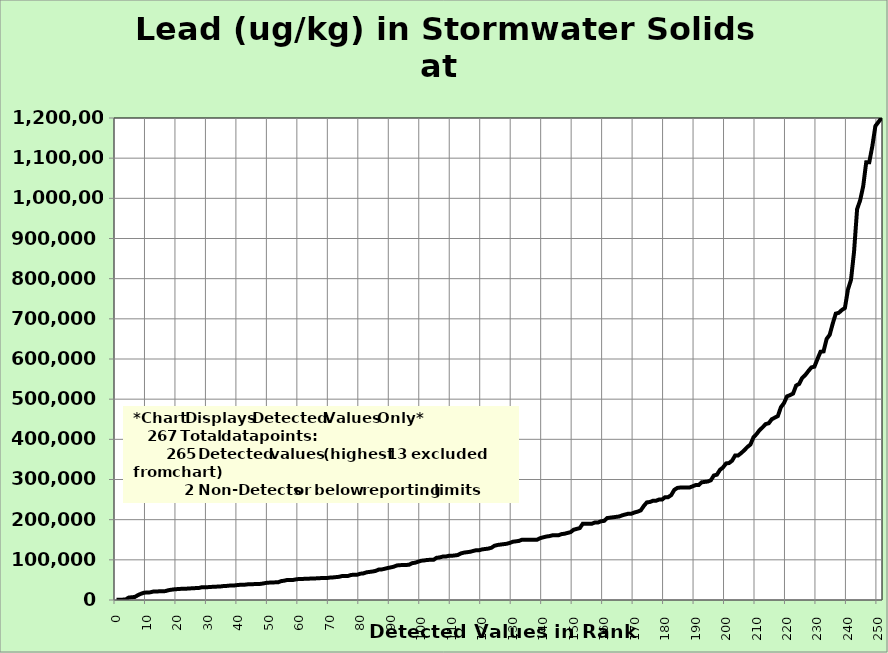
| Category | Lead |
|---|---|
| 0.0 | 323 |
| 1.0 | 347 |
| 2.0 | 887 |
| 3.0 | 1390 |
| 4.0 | 5980 |
| 5.0 | 6850 |
| 6.0 | 7530 |
| 7.0 | 12000 |
| 8.0 | 15500 |
| 9.0 | 18100 |
| 10.0 | 18700 |
| 11.0 | 19000 |
| 12.0 | 20900 |
| 13.0 | 21100 |
| 14.0 | 21600 |
| 15.0 | 22000 |
| 16.0 | 22100 |
| 17.0 | 24300 |
| 18.0 | 25600 |
| 19.0 | 26600 |
| 20.0 | 27200 |
| 21.0 | 27700 |
| 22.0 | 28100 |
| 23.0 | 28200 |
| 24.0 | 28900 |
| 25.0 | 29000 |
| 26.0 | 29700 |
| 27.0 | 29900 |
| 28.0 | 31800 |
| 29.0 | 32000 |
| 30.0 | 32000 |
| 31.0 | 32500 |
| 32.0 | 33200 |
| 33.0 | 33300 |
| 34.0 | 33600 |
| 35.0 | 34600 |
| 36.0 | 35000 |
| 37.0 | 35800 |
| 38.0 | 35900 |
| 39.0 | 36500 |
| 40.0 | 37500 |
| 41.0 | 38000 |
| 42.0 | 38000 |
| 43.0 | 39000 |
| 44.0 | 39300 |
| 45.0 | 39500 |
| 46.0 | 39900 |
| 47.0 | 39900 |
| 48.0 | 41000 |
| 49.0 | 42500 |
| 50.0 | 43200 |
| 51.0 | 43700 |
| 52.0 | 43900 |
| 53.0 | 44000 |
| 54.0 | 47000 |
| 55.0 | 48000 |
| 56.0 | 49900 |
| 57.0 | 50000 |
| 58.0 | 50000 |
| 59.0 | 51600 |
| 60.0 | 52300 |
| 61.0 | 52400 |
| 62.0 | 52900 |
| 63.0 | 53000 |
| 64.0 | 53600 |
| 65.0 | 53700 |
| 66.0 | 54000 |
| 67.0 | 54500 |
| 68.0 | 54500 |
| 69.0 | 54600 |
| 70.0 | 55800 |
| 71.0 | 56200 |
| 72.0 | 57000 |
| 73.0 | 57700 |
| 74.0 | 59700 |
| 75.0 | 59900 |
| 76.0 | 60000 |
| 77.0 | 62400 |
| 78.0 | 62900 |
| 79.0 | 63000 |
| 80.0 | 65500 |
| 81.0 | 66200 |
| 82.0 | 68900 |
| 83.0 | 69900 |
| 84.0 | 70900 |
| 85.0 | 72400 |
| 86.0 | 75700 |
| 87.0 | 76000 |
| 88.0 | 77800 |
| 89.0 | 79700 |
| 90.0 | 81200 |
| 91.0 | 83000 |
| 92.0 | 86000 |
| 93.0 | 86800 |
| 94.0 | 86900 |
| 95.0 | 87100 |
| 96.0 | 87900 |
| 97.0 | 91700 |
| 98.0 | 92800 |
| 99.0 | 95400 |
| 100.0 | 97800 |
| 101.0 | 98500 |
| 102.0 | 99800 |
| 103.0 | 100000 |
| 104.0 | 100000 |
| 105.0 | 105000 |
| 106.0 | 106000 |
| 107.0 | 108000 |
| 108.0 | 108000 |
| 109.0 | 110000 |
| 110.0 | 110000 |
| 111.0 | 111000 |
| 112.0 | 112000 |
| 113.0 | 116000 |
| 114.0 | 118000 |
| 115.0 | 119000 |
| 116.0 | 120000 |
| 117.0 | 122000 |
| 118.0 | 124000 |
| 119.0 | 124000 |
| 120.0 | 126000 |
| 121.0 | 127000 |
| 122.0 | 128000 |
| 123.0 | 130000 |
| 124.0 | 135000 |
| 125.0 | 137000 |
| 126.0 | 138000 |
| 127.0 | 139000 |
| 128.0 | 140000 |
| 129.0 | 142000 |
| 130.0 | 145000 |
| 131.0 | 146000 |
| 132.0 | 147000 |
| 133.0 | 150000 |
| 134.0 | 150000 |
| 135.0 | 150000 |
| 136.0 | 150000 |
| 137.0 | 150000 |
| 138.0 | 150000 |
| 139.0 | 154000 |
| 140.0 | 156000 |
| 141.0 | 158000 |
| 142.0 | 159000 |
| 143.0 | 161000 |
| 144.0 | 161000 |
| 145.0 | 161000 |
| 146.0 | 164000 |
| 147.0 | 165000 |
| 148.0 | 167000 |
| 149.0 | 169000 |
| 150.0 | 175000 |
| 151.0 | 177000 |
| 152.0 | 179000 |
| 153.0 | 190000 |
| 154.0 | 190000 |
| 155.0 | 190000 |
| 156.0 | 190000 |
| 157.0 | 193000 |
| 158.0 | 193000 |
| 159.0 | 196000 |
| 160.0 | 197000 |
| 161.0 | 204000 |
| 162.0 | 205000 |
| 163.0 | 206000 |
| 164.0 | 207000 |
| 165.0 | 208000 |
| 166.0 | 211000 |
| 167.0 | 213000 |
| 168.0 | 215000 |
| 169.0 | 215000 |
| 170.0 | 218000 |
| 171.0 | 220000 |
| 172.0 | 223000 |
| 173.0 | 234000 |
| 174.0 | 243000 |
| 175.0 | 244000 |
| 176.0 | 247000 |
| 177.0 | 247000 |
| 178.0 | 250000 |
| 179.0 | 250000 |
| 180.0 | 256000 |
| 181.0 | 256000 |
| 182.0 | 261000 |
| 183.0 | 274000 |
| 184.0 | 279000 |
| 185.0 | 280000 |
| 186.0 | 280000 |
| 187.0 | 280000 |
| 188.0 | 280000 |
| 189.0 | 283000 |
| 190.0 | 286000 |
| 191.0 | 286000 |
| 192.0 | 293000 |
| 193.0 | 294000 |
| 194.0 | 295000 |
| 195.0 | 298000 |
| 196.0 | 310000 |
| 197.0 | 312000 |
| 198.0 | 324000 |
| 199.0 | 330000 |
| 200.0 | 340000 |
| 201.0 | 341000 |
| 202.0 | 347000 |
| 203.0 | 360000 |
| 204.0 | 360000 |
| 205.0 | 366000 |
| 206.0 | 373000 |
| 207.0 | 381000 |
| 208.0 | 387000 |
| 209.0 | 405000 |
| 210.0 | 413000 |
| 211.0 | 423000 |
| 212.0 | 430000 |
| 213.0 | 438000 |
| 214.0 | 440000 |
| 215.0 | 450000 |
| 216.0 | 454000 |
| 217.0 | 458000 |
| 218.0 | 480000 |
| 219.0 | 490000 |
| 220.0 | 507000 |
| 221.0 | 510000 |
| 222.0 | 514000 |
| 223.0 | 534000 |
| 224.0 | 538000 |
| 225.0 | 553000 |
| 226.0 | 560000 |
| 227.0 | 570000 |
| 228.0 | 579000 |
| 229.0 | 581000 |
| 230.0 | 600000 |
| 231.0 | 618000 |
| 232.0 | 619000 |
| 233.0 | 650000 |
| 234.0 | 660000 |
| 235.0 | 688000 |
| 236.0 | 713000 |
| 237.0 | 715000 |
| 238.0 | 722000 |
| 239.0 | 727000 |
| 240.0 | 773000 |
| 241.0 | 797000 |
| 242.0 | 867000 |
| 243.0 | 973000 |
| 244.0 | 995000 |
| 245.0 | 1030000 |
| 246.0 | 1090000 |
| 247.0 | 1090000 |
| 248.0 | 1130000 |
| 249.0 | 1180000 |
| 250.0 | 1190000 |
| 251.0 | 1200000 |